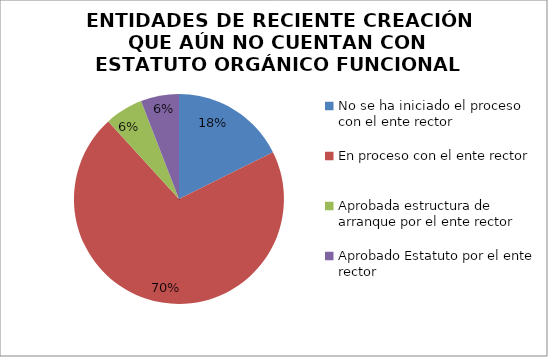
| Category | Series 0 |
|---|---|
| No se ha iniciado el proceso con el ente rector | 3 |
| En proceso con el ente rector | 12 |
| Aprobada estructura de arranque por el ente rector | 1 |
| Aprobado Estatuto por el ente rector | 1 |